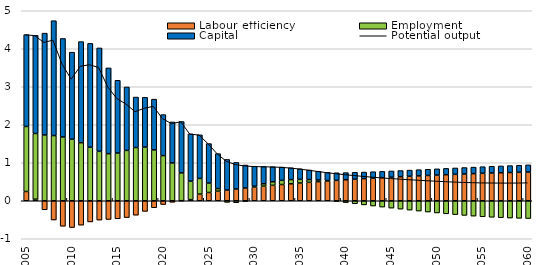
| Category | Labour efficiency | Employment | Capital |
|---|---|---|---|
| 2005-01-01 | 0.244 | 1.71 | 2.417 |
| 2006-01-01 | 0.041 | 1.729 | 2.583 |
| 2007-01-01 | -0.238 | 1.732 | 2.679 |
| 2008-01-01 | -0.506 | 1.715 | 3.023 |
| 2009-01-01 | -0.671 | 1.679 | 2.592 |
| 2010-01-01 | -0.704 | 1.621 | 2.289 |
| 2011-01-01 | -0.642 | 1.528 | 2.661 |
| 2012-01-01 | -0.557 | 1.41 | 2.732 |
| 2013-01-01 | -0.509 | 1.301 | 2.721 |
| 2014-01-01 | -0.492 | 1.239 | 2.257 |
| 2015-01-01 | -0.474 | 1.256 | 1.914 |
| 2016-01-01 | -0.443 | 1.326 | 1.669 |
| 2017-01-01 | -0.38 | 1.401 | 1.329 |
| 2018-01-01 | -0.28 | 1.412 | 1.31 |
| 2019-01-01 | -0.184 | 1.339 | 1.335 |
| 2020-01-01 | -0.099 | 1.188 | 1.08 |
| 2021-01-01 | -0.04 | 0.996 | 1.079 |
| 2022-01-01 | 0.001 | 0.733 | 1.351 |
| 2023-01-01 | 0.03 | 0.485 | 1.244 |
| 2024-01-01 | 0.176 | 0.412 | 1.148 |
| 2025-01-01 | 0.217 | 0.249 | 1.039 |
| 2026-01-01 | 0.253 | 0.066 | 0.921 |
| 2027-01-01 | 0.282 | -0.042 | 0.805 |
| 2028-01-01 | 0.31 | -0.052 | 0.699 |
| 2029-01-01 | 0.336 | -0.018 | 0.604 |
| 2030-01-01 | 0.361 | 0.022 | 0.523 |
| 2031-01-01 | 0.385 | 0.062 | 0.454 |
| 2032-01-01 | 0.407 | 0.093 | 0.396 |
| 2033-01-01 | 0.427 | 0.109 | 0.349 |
| 2034-01-01 | 0.447 | 0.11 | 0.31 |
| 2035-01-01 | 0.467 | 0.097 | 0.278 |
| 2036-01-01 | 0.485 | 0.073 | 0.252 |
| 2037-01-01 | 0.503 | 0.044 | 0.23 |
| 2038-01-01 | 0.52 | 0.013 | 0.213 |
| 2039-01-01 | 0.537 | -0.018 | 0.199 |
| 2040-01-01 | 0.553 | -0.049 | 0.188 |
| 2041-01-01 | 0.569 | -0.079 | 0.18 |
| 2042-01-01 | 0.582 | -0.109 | 0.173 |
| 2043-01-01 | 0.596 | -0.138 | 0.169 |
| 2044-01-01 | 0.609 | -0.166 | 0.165 |
| 2045-01-01 | 0.621 | -0.194 | 0.163 |
| 2046-01-01 | 0.633 | -0.22 | 0.162 |
| 2047-01-01 | 0.644 | -0.246 | 0.162 |
| 2048-01-01 | 0.655 | -0.271 | 0.162 |
| 2049-01-01 | 0.666 | -0.296 | 0.163 |
| 2050-01-01 | 0.676 | -0.321 | 0.164 |
| 2051-01-01 | 0.686 | -0.344 | 0.166 |
| 2052-01-01 | 0.695 | -0.365 | 0.168 |
| 2053-01-01 | 0.705 | -0.386 | 0.17 |
| 2054-01-01 | 0.714 | -0.404 | 0.172 |
| 2055-01-01 | 0.722 | -0.421 | 0.174 |
| 2056-01-01 | 0.73 | -0.434 | 0.177 |
| 2057-01-01 | 0.737 | -0.445 | 0.18 |
| 2058-01-01 | 0.743 | -0.455 | 0.183 |
| 2059-01-01 | 0.749 | -0.463 | 0.186 |
| 2060-01-01 | 0.755 | -0.468 | 0.19 |